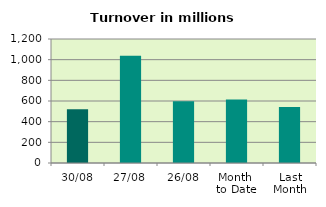
| Category | Series 0 |
|---|---|
| 30/08 | 519.387 |
| 27/08 | 1036.884 |
| 26/08 | 597.211 |
| Month 
to Date | 614.44 |
| Last
Month | 542.77 |